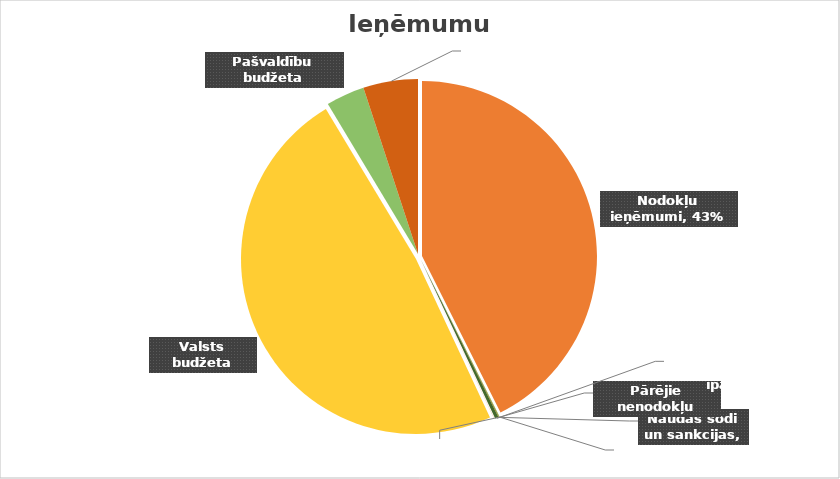
| Category | Series 0 |
|---|---|
| Nodokļu ieņēmumi | 15590525 |
| Procentu ieņēmumi par kontu atlikumiem | 2343 |
| Valsts (pašvaldību) un kancelejas nodevas | 18284 |
| Naudas sodi un sankcijas | 2160 |
| Pārējie nenodokļu ieņēmumi   | 22522 |
| Ieņēmumi no pašvaldības īpašumu pārdošanas | 114371 |
| No valsts budžeta daļēji finansētu atvasinātu publisku personu un budžeta nefinansētu iestāžu transferti | 7760 |
| Valsts budžeta transferti | 17691092 |
| Pašvaldību budžeta transferti | 1303900 |
| Budžeta iestāžu ieņēmumi | 1847890 |